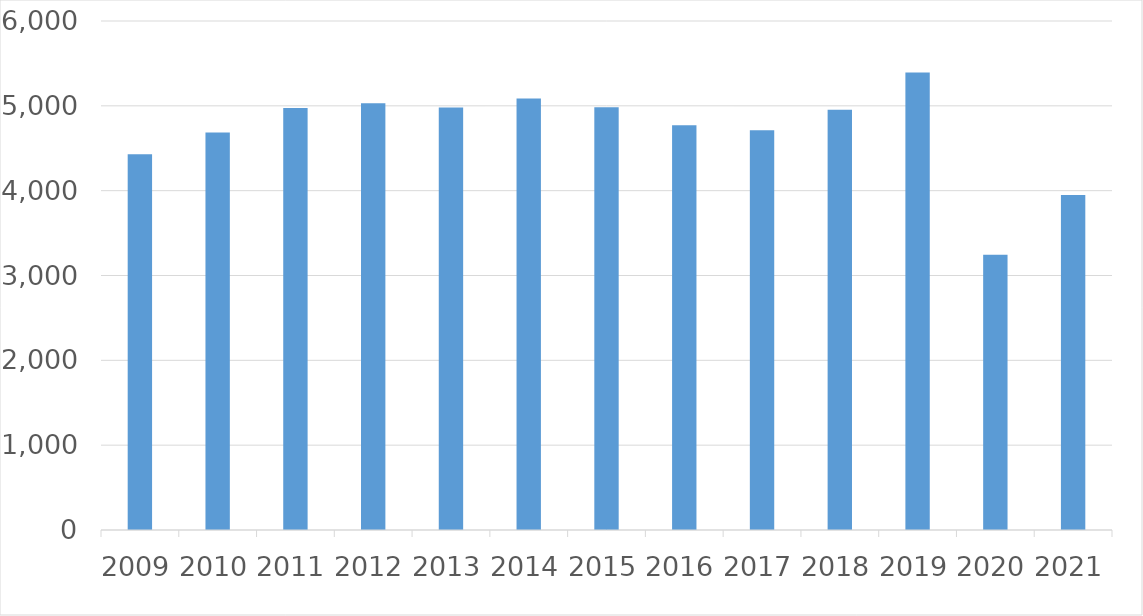
| Category | Series 0 |
|---|---|
| 2009 | 4428 |
| 2010 | 4686 |
| 2011 | 4974 |
| 2012 | 5029 |
| 2013 | 4979 |
| 2014 | 5086 |
| 2015 | 4983 |
| 2016 | 4771 |
| 2017 | 4712 |
| 2018 | 4954 |
| 2019 | 5394 |
| 2020 | 3244 |
| 2021 | 3948 |